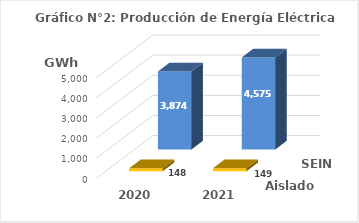
| Category | Aislados | SEIN |
|---|---|---|
| 2020.0 | 147.964 | 3873.912 |
| 2021.0 | 149.285 | 4575.378 |